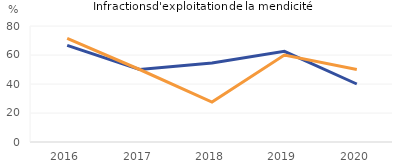
| Category | Affaires poursuivies pour une infraction avec au moins une victime mineure | Auteurs pousuivis pour une infraction avec  au moins une victime mineure |
|---|---|---|
| 2016.0 | 66.667 | 71.429 |
| 2017.0 | 50 | 50 |
| 2018.0 | 54.545 | 27.586 |
| 2019.0 | 62.5 | 60 |
| 2020.0 | 40 | 50 |